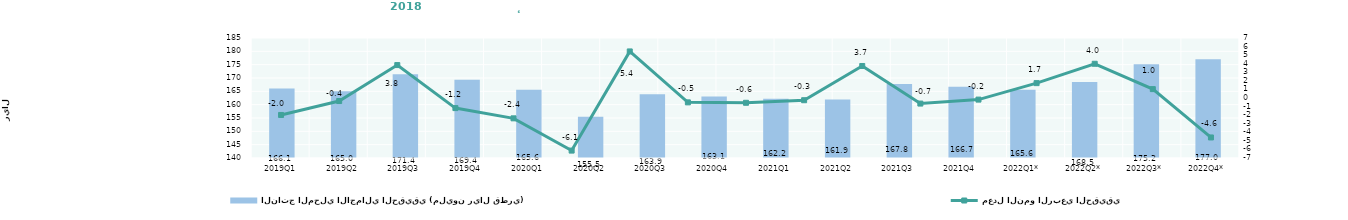
| Category | الناتج المحلي الاجمالي الحقيقي (مليون ريال قطري)  |
|---|---|
| 2019Q1 | 166107.183 |
| 2019Q2 | 165024.953 |
| 2019Q3 | 171410.464 |
| 2019Q4 | 169389.535 |
| 2020Q1 | 165614.977 |
| 2020Q2 | 155452.718 |
| 2020Q3 | 163897.514 |
| 2020Q4 | 163062.24 |
| 2021Q1 | 162182.834 |
| 2021Q2 | 161924.617 |
| 2021Q3 | 167781.848 |
| 2021Q4 | 166680.563 |
| 2022Q1* | 165599.931 |
| 2022Q2* | 168473.607 |
| 2022Q3* | 175199.537 |
| 2022Q4* | 177015.145 |